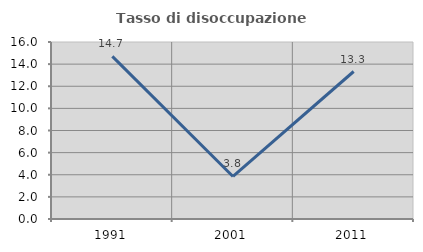
| Category | Tasso di disoccupazione giovanile  |
|---|---|
| 1991.0 | 14.706 |
| 2001.0 | 3.846 |
| 2011.0 | 13.333 |